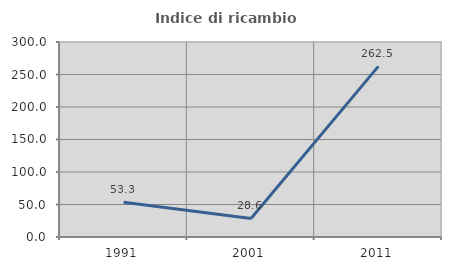
| Category | Indice di ricambio occupazionale  |
|---|---|
| 1991.0 | 53.333 |
| 2001.0 | 28.571 |
| 2011.0 | 262.5 |